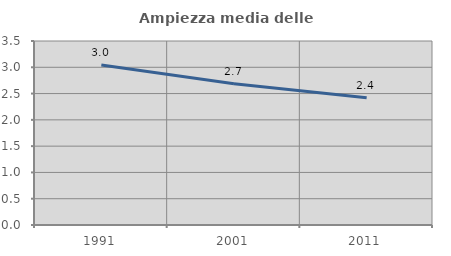
| Category | Ampiezza media delle famiglie |
|---|---|
| 1991.0 | 3.043 |
| 2001.0 | 2.688 |
| 2011.0 | 2.421 |